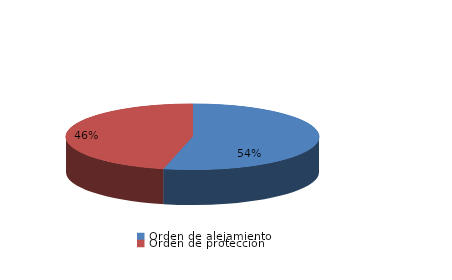
| Category | Series 0 |
|---|---|
| Orden de alejamiento | 161 |
| Orden de protección | 139 |